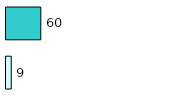
| Category | Series 0 | Series 1 |
|---|---|---|
| 0 | 9 | 60 |